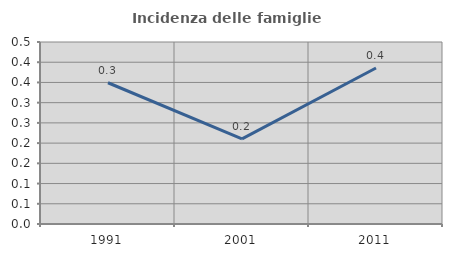
| Category | Incidenza delle famiglie numerose |
|---|---|
| 1991.0 | 0.349 |
| 2001.0 | 0.211 |
| 2011.0 | 0.386 |